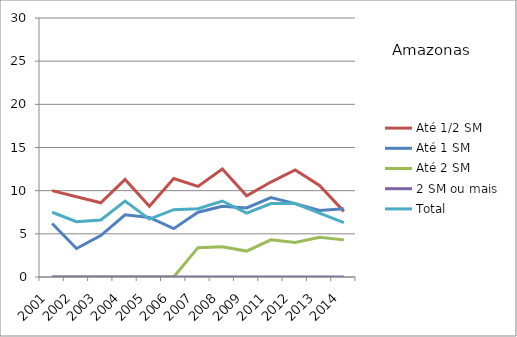
| Category | Até 1/2 SM | Até 1 SM | Até 2 SM | 2 SM ou mais | Total |
|---|---|---|---|---|---|
| 2001.0 | 10 | 6.2 | 0 | 0 | 7.5 |
| 2002.0 | 9.3 | 3.3 | 0 | 0 | 6.4 |
| 2003.0 | 8.6 | 4.8 | 0 | 0 | 6.6 |
| 2004.0 | 11.3 | 7.2 | 0 | 0 | 8.8 |
| 2005.0 | 8.2 | 6.9 | 0 | 0 | 6.7 |
| 2006.0 | 11.4 | 5.6 | 0 | 0 | 7.8 |
| 2007.0 | 10.5 | 7.5 | 3.4 | 0 | 7.9 |
| 2008.0 | 12.5 | 8.2 | 3.5 | 0 | 8.8 |
| 2009.0 | 9.4 | 8 | 3 | 0 | 7.4 |
| 2011.0 | 11 | 9.2 | 4.3 | 0 | 8.5 |
| 2012.0 | 12.4 | 8.5 | 4 | 0 | 8.5 |
| 2013.0 | 10.6 | 7.7 | 4.6 | 0 | 7.4 |
| 2014.0 | 7.6 | 7.9 | 4.3 | 0 | 6.3 |